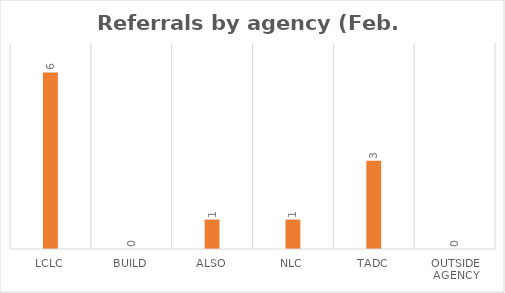
| Category | Series 0 |
|---|---|
| LCLC | 6 |
| BUILD | 0 |
| ALSO | 1 |
| NLC | 1 |
| TADC | 3 |
| Outside Agency | 0 |